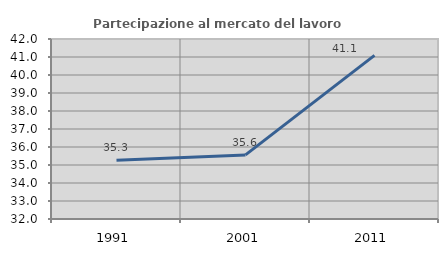
| Category | Partecipazione al mercato del lavoro  femminile |
|---|---|
| 1991.0 | 35.265 |
| 2001.0 | 35.561 |
| 2011.0 | 41.09 |